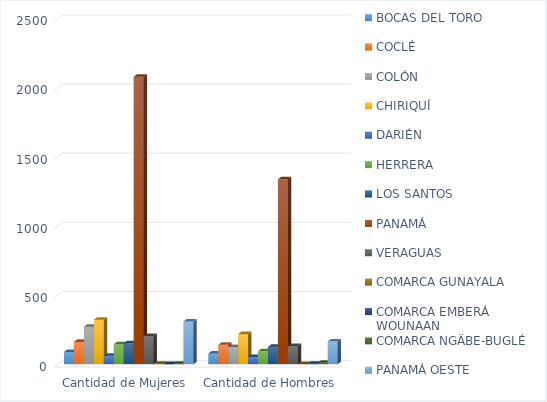
| Category | BOCAS DEL TORO | COCLÉ | COLÓN | CHIRIQUÍ | DARIÉN | HERRERA | LOS SANTOS | PANAMÁ | VERAGUAS | COMARCA GUNAYALA | COMARCA EMBERÁ WOUNAAN | COMARCA NGÄBE-BUGLÉ | PANAMÁ OESTE |
|---|---|---|---|---|---|---|---|---|---|---|---|---|---|
| Cantidad de Mujeres | 89 | 162 | 271 | 322 | 61 | 145 | 151 | 2078 | 204 | 4 | 1 | 4 | 309 |
| Cantidad de Hombres | 78 | 141 | 125 | 218 | 52 | 94 | 126 | 1337 | 132 | 2 | 4 | 11 | 165 |